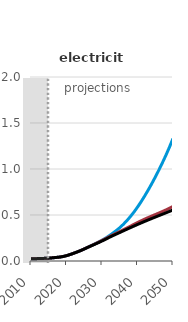
| Category | Autonomous battery electric vehicle | Autonomous hybrid electric vehicle  | Reference |
|---|---|---|---|
| 2010.0 | 0.024 | 0.024 | 0.024 |
| 2011.0 | 0.025 | 0.025 | 0.025 |
| 2012.0 | 0.026 | 0.026 | 0.026 |
| 2013.0 | 0.028 | 0.028 | 0.028 |
| 2014.0 | 0.029 | 0.029 | 0.029 |
| 2015.0 | 0.031 | 0.031 | 0.031 |
| 2016.0 | 0.034 | 0.034 | 0.034 |
| 2017.0 | 0.038 | 0.038 | 0.038 |
| 2018.0 | 0.042 | 0.042 | 0.042 |
| 2019.0 | 0.048 | 0.048 | 0.048 |
| 2020.0 | 0.058 | 0.058 | 0.058 |
| 2021.0 | 0.07 | 0.07 | 0.07 |
| 2022.0 | 0.084 | 0.084 | 0.084 |
| 2023.0 | 0.098 | 0.098 | 0.098 |
| 2024.0 | 0.113 | 0.113 | 0.113 |
| 2025.0 | 0.131 | 0.131 | 0.131 |
| 2026.0 | 0.15 | 0.149 | 0.148 |
| 2027.0 | 0.168 | 0.167 | 0.165 |
| 2028.0 | 0.186 | 0.185 | 0.182 |
| 2029.0 | 0.205 | 0.204 | 0.199 |
| 2030.0 | 0.226 | 0.223 | 0.217 |
| 2031.0 | 0.248 | 0.243 | 0.236 |
| 2032.0 | 0.274 | 0.264 | 0.256 |
| 2033.0 | 0.301 | 0.283 | 0.274 |
| 2034.0 | 0.33 | 0.301 | 0.292 |
| 2035.0 | 0.362 | 0.32 | 0.309 |
| 2036.0 | 0.398 | 0.339 | 0.327 |
| 2037.0 | 0.438 | 0.359 | 0.345 |
| 2038.0 | 0.483 | 0.378 | 0.362 |
| 2039.0 | 0.532 | 0.398 | 0.38 |
| 2040.0 | 0.586 | 0.418 | 0.397 |
| 2041.0 | 0.643 | 0.437 | 0.414 |
| 2042.0 | 0.705 | 0.455 | 0.43 |
| 2043.0 | 0.771 | 0.472 | 0.446 |
| 2044.0 | 0.839 | 0.489 | 0.462 |
| 2045.0 | 0.912 | 0.505 | 0.477 |
| 2046.0 | 0.987 | 0.521 | 0.493 |
| 2047.0 | 1.066 | 0.538 | 0.508 |
| 2048.0 | 1.149 | 0.555 | 0.523 |
| 2049.0 | 1.237 | 0.574 | 0.539 |
| 2050.0 | 1.332 | 0.594 | 0.555 |